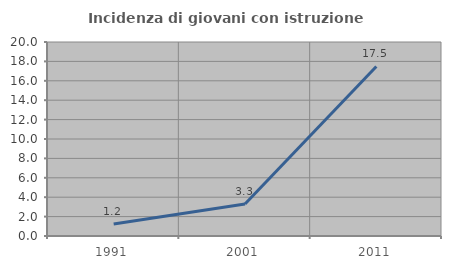
| Category | Incidenza di giovani con istruzione universitaria |
|---|---|
| 1991.0 | 1.227 |
| 2001.0 | 3.3 |
| 2011.0 | 17.479 |